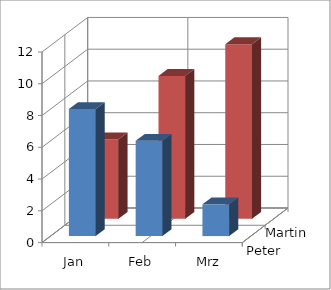
| Category | Peter | Martin |
|---|---|---|
| Jan | 8 | 5 |
| Feb | 6 | 9 |
| Mrz | 2 | 11 |